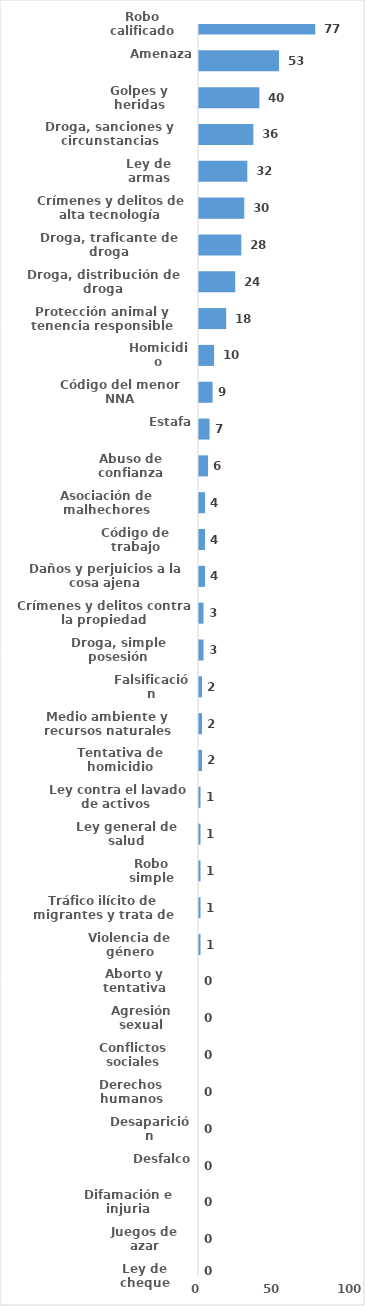
| Category | Series 0 |
|---|---|
| Robo calificado | 77 |
| Amenaza | 53 |
| Golpes y heridas | 40 |
| Droga, sanciones y circunstancias agravantes | 36 |
| Ley de armas | 32 |
| Crímenes y delitos de alta tecnología | 30 |
| Droga, traficante de droga | 28 |
| Droga, distribución de droga | 24 |
| Protección animal y tenencia responsible | 18 |
| Homicidio | 10 |
| Código del menor NNA | 9 |
| Estafa | 7 |
| Abuso de confianza | 6 |
| Asociación de malhechores | 4 |
| Código de trabajo | 4 |
| Daños y perjuicios a la cosa ajena | 4 |
| Crímenes y delitos contra la propiedad | 3 |
| Droga, simple posesión | 3 |
| Falsificación | 2 |
| Medio ambiente y recursos naturales | 2 |
| Tentativa de homicidio | 2 |
| Ley contra el lavado de activos  | 1 |
| Ley general de salud | 1 |
| Robo simple | 1 |
| Tráfico ilícito de migrantes y trata de personas | 1 |
| Violencia de género | 1 |
| Aborto y tentativa | 0 |
| Agresión sexual | 0 |
| Conflictos sociales | 0 |
| Derechos humanos | 0 |
| Desaparición | 0 |
| Desfalco | 0 |
| Difamación e injuria | 0 |
| Juegos de azar | 0 |
| Ley de cheque | 0 |